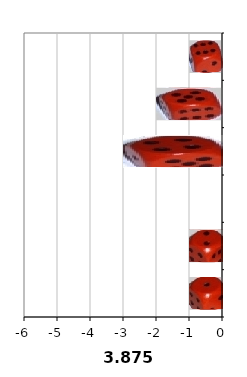
| Category | Series 1 |
|---|---|
| 1.0 | -1 |
| 2.0 | -1 |
| 3.0 | 0 |
| 4.0 | -3 |
| 5.0 | -2 |
| 6.0 | -1 |